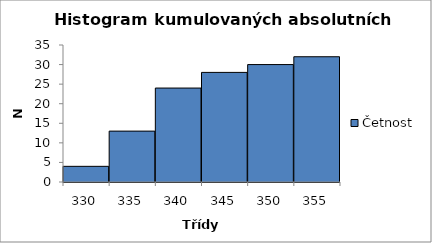
| Category | Četnost |
|---|---|
| 330.0 | 4 |
| 335.0 | 13 |
| 340.0 | 24 |
| 345.0 | 28 |
| 350.0 | 30 |
| 355.0 | 32 |